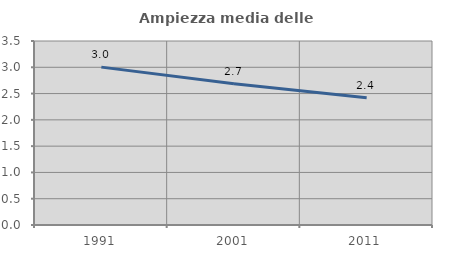
| Category | Ampiezza media delle famiglie |
|---|---|
| 1991.0 | 3.003 |
| 2001.0 | 2.685 |
| 2011.0 | 2.422 |